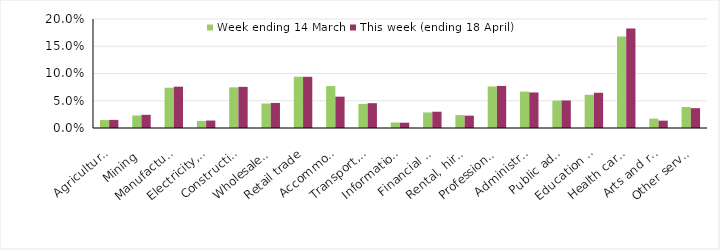
| Category | Week ending 14 March | This week (ending 18 April) |
|---|---|---|
| Agriculture, forestry and fishing | 0.015 | 0.015 |
| Mining | 0.023 | 0.024 |
| Manufacturing | 0.074 | 0.076 |
| Electricity, gas, water and waste services | 0.013 | 0.014 |
| Construction | 0.075 | 0.075 |
| Wholesale trade | 0.045 | 0.046 |
| Retail trade | 0.094 | 0.094 |
| Accommodation and food services | 0.077 | 0.058 |
| Transport, postal and warehousing | 0.044 | 0.046 |
| Information media and telecommunications | 0.01 | 0.01 |
| Financial and insurance services | 0.029 | 0.03 |
| Rental, hiring and real estate services | 0.024 | 0.023 |
| Professional, scientific and technical services | 0.076 | 0.077 |
| Administrative and support services | 0.067 | 0.065 |
| Public administration and safety | 0.05 | 0.051 |
| Education and training | 0.061 | 0.065 |
| Health care and social assistance | 0.168 | 0.183 |
| Arts and recreation services | 0.017 | 0.013 |
| Other services | 0.038 | 0.036 |